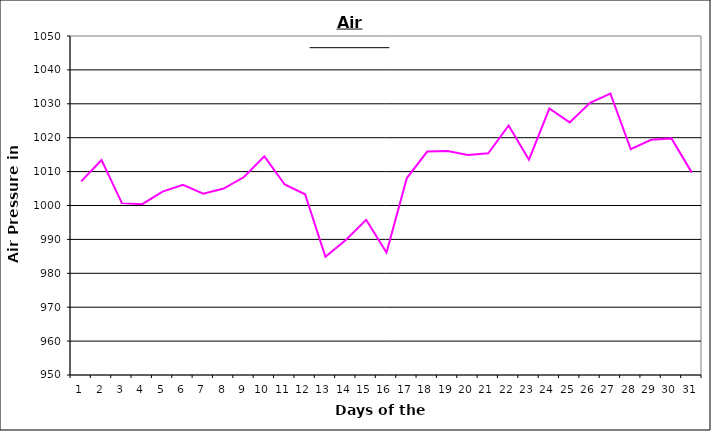
| Category | Series 0 |
|---|---|
| 0 | 1007.1 |
| 1 | 1013.4 |
| 2 | 1000.7 |
| 3 | 1000.4 |
| 4 | 1004.1 |
| 5 | 1006.1 |
| 6 | 1003.5 |
| 7 | 1005 |
| 8 | 1008.4 |
| 9 | 1014.5 |
| 10 | 1006.2 |
| 11 | 1003.3 |
| 12 | 984.9 |
| 13 | 989.8 |
| 14 | 995.8 |
| 15 | 986.1 |
| 16 | 1008.1 |
| 17 | 1015.9 |
| 18 | 1016.1 |
| 19 | 1014.9 |
| 20 | 1015.4 |
| 21 | 1023.6 |
| 22 | 1013.5 |
| 23 | 1028.6 |
| 24 | 1024.5 |
| 25 | 1030.3 |
| 26 | 1033 |
| 27 | 1016.6 |
| 28 | 1019.4 |
| 29 | 1019.8 |
| 30 | 1009.7 |